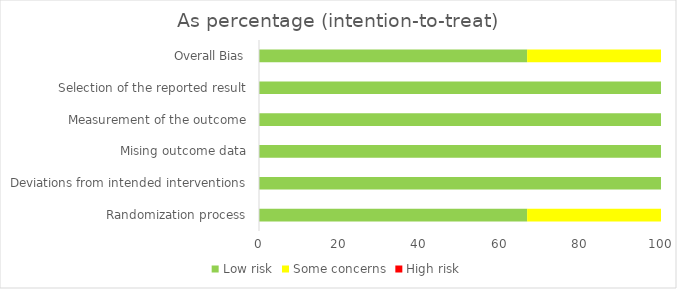
| Category | Low risk | Some concerns | High risk |
|---|---|---|---|
| Randomization process | 66.7 | 33.3 | 0 |
| Deviations from intended interventions | 100 | 0 | 0 |
| Mising outcome data | 100 | 0 | 0 |
| Measurement of the outcome | 100 | 0 | 0 |
| Selection of the reported result | 100 | 0 | 0 |
| Overall Bias | 66.7 | 33.3 | 0 |